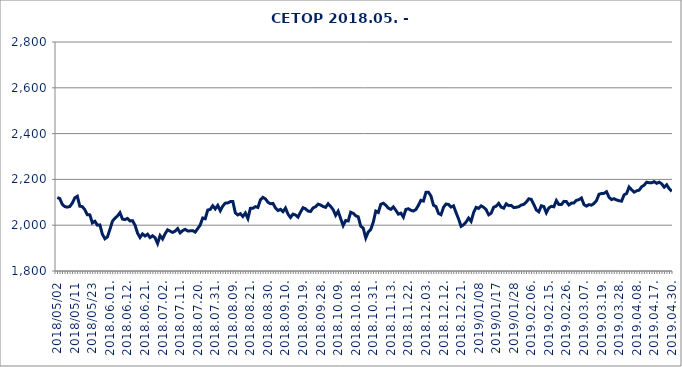
| Category | CETOP |
|---|---|
| 2018.05.02 | 2120.676 |
| 2018.05.03 | 2116.403 |
| 2018.05.04 | 2091.509 |
| 2018.05.07 | 2081.159 |
| 2018.05.08 | 2078.872 |
| 2018.05.09 | 2081.466 |
| 2018.05.10 | 2096.478 |
| 2018.05.11 | 2119.512 |
| 2018.05.14 | 2126.331 |
| 2018.05.15 | 2082.985 |
| 2018.05.16 | 2081.073 |
| 2018.05.17 | 2067.804 |
| 2018.05.18 | 2045.295 |
| 2018.05.22 | 2045.083 |
| 2018.05.23 | 2010.11 |
| 2018.05.24 | 2017.202 |
| 2018.05.25 | 2000.263 |
| 2018.05.28 | 2001.262 |
| 2018.05.29 | 1960.226 |
| 2018.05.30 | 1940.766 |
| 2018.05.31 | 1948.804 |
| 2018.06.01. | 1981.607 |
| 2018.06.04. | 2017.379 |
| 2018.06.05. | 2030.57 |
| 2018.06.06. | 2040.195 |
| 2018.06.07. | 2054.549 |
| 2018.06.08. | 2026.941 |
| 2018.06.11. | 2024.503 |
| 2018.06.12. | 2029.551 |
| 2018.06.13. | 2018.61 |
| 2018.06.14. | 2019.788 |
| 2018.06.15. | 2000.297 |
| 2018.06.18. | 1965.713 |
| 2018.06.19. | 1946.535 |
| 2018.06.20. | 1961.945 |
| 2018.06.21. | 1952.863 |
| 2018.06.22. | 1960.475 |
| 2018.06.25. | 1946.032 |
| 2018.06.26. | 1953.878 |
| 2018.06.27. | 1945.559 |
| 2018.06.28. | 1920.09 |
| 2018.06.29. | 1954.479 |
| 2018.07.02. | 1939.762 |
| 2018.07.03. | 1962.624 |
| 2018.07.04. | 1979.793 |
| 2018.07.05. | 1973.884 |
| 2018.07.06. | 1968.41 |
| 2018.07.09. | 1974.196 |
| 2018.07.10. | 1985.28 |
| 2018.07.11. | 1966.571 |
| 2018.07.12. | 1976.141 |
| 2018.07.13. | 1981.892 |
| 2018.07.16. | 1974.924 |
| 2018.07.17. | 1975.254 |
| 2018.07.18. | 1976.278 |
| 2018.07.19. | 1969.906 |
| 2018.07.20. | 1984.979 |
| 2018.07.23. | 2001.025 |
| 2018.07.24. | 2031.395 |
| 2018.07.25. | 2028.303 |
| 2018.07.26. | 2066.067 |
| 2018.07.27. | 2069.026 |
| 2018.07.30. | 2084.845 |
| 2018.07.31. | 2070.985 |
| 2018.08.01. | 2086.424 |
| 2018.08.02. | 2063.149 |
| 2018.08.03. | 2083.848 |
| 2018.08.06. | 2096.272 |
| 2018.08.07. | 2097.369 |
| 2018.08.08. | 2103.062 |
| 2018.08.09. | 2103.669 |
| 2018.08.10. | 2053.985 |
| 2018.08.13. | 2044.675 |
| 2018.08.14. | 2050.336 |
| 2018.08.15. | 2038.076 |
| 2018.08.16. | 2053.282 |
| 2018.08.17. | 2029.237 |
| 2018.08.21. | 2073.528 |
| 2018.08.22. | 2074.081 |
| 2018.08.23. | 2080.932 |
| 2018.08.24. | 2077.489 |
| 2018.08.27. | 2110.84 |
| 2018.08.28. | 2121.74 |
| 2018.08.29. | 2114.778 |
| 2018.08.30. | 2100.306 |
| 2018.08.31. | 2093.626 |
| 2018.09.03. | 2095.064 |
| 2018.09.04. | 2075.524 |
| 2018.09.05. | 2064.011 |
| 2018.09.06. | 2069.342 |
| 2018.09.07. | 2059.094 |
| 2018.09.10. | 2074.752 |
| 2018.09.11. | 2048.405 |
| 2018.09.12. | 2033.609 |
| 2018.09.13. | 2048.437 |
| 2018.09.14. | 2044.669 |
| 2018.09.17. | 2035.145 |
| 2018.09.18. | 2057.368 |
| 2018.09.19. | 2076.376 |
| 2018.09.20. | 2071.472 |
| 2018.09.21. | 2061.603 |
| 2018.09.24. | 2059.922 |
| 2018.09.25. | 2075.697 |
| 2018.09.26. | 2080.405 |
| 2018.09.27. | 2092.125 |
| 2018.09.28. | 2088.019 |
| 2018.10.01. | 2081.721 |
| 2018.10.02. | 2077.783 |
| 2018.10.03. | 2093.707 |
| 2018.10.04. | 2081.947 |
| 2018.10.05. | 2067.958 |
| 2018.10.08. | 2043.078 |
| 2018.10.09. | 2060.729 |
| 2018.10.10. | 2028.707 |
| 2018.10.11. | 1998.129 |
| 2018.10.12. | 2020.267 |
| 2018.10.15. | 2018.392 |
| 2018.10.16. | 2056.747 |
| 2018.10.17. | 2051.812 |
| 2018.10.18. | 2040.854 |
| 2018.10.19. | 2036.722 |
| 2018.10.24. | 1995.93 |
| 2018.10.25. | 1986.844 |
| 2018.10.26. | 1944.458 |
| 2018.10.29. | 1970.626 |
| 2018.10.30. | 1981.597 |
| 2018.10.31. | 2013.278 |
| 2018.11.05. | 2061.555 |
| 2018.11.06. | 2055.53 |
| 2018.11.07. | 2091.353 |
| 2018.11.08. | 2095.811 |
| 2018.11.09. | 2087.516 |
| 2018.11.12. | 2074.427 |
| 2018.11.13. | 2069.375 |
| 2018.11.14. | 2080.014 |
| 2018.11.15. | 2065.08 |
| 2018.11.16. | 2048.304 |
| 2018.11.19. | 2052.459 |
| 2018.11.20. | 2035.179 |
| 2018.11.21. | 2069.042 |
| 2018.11.22. | 2071.897 |
| 2018.11.23. | 2064.961 |
| 2018.11.26. | 2062.049 |
| 2018.11.27. | 2068.398 |
| 2018.11.28. | 2087.286 |
| 2018.11.29. | 2108.668 |
| 2018.11.30. | 2105.427 |
| 2018.12.03. | 2143.383 |
| 2018.12.04. | 2143.814 |
| 2018.12.05. | 2127.321 |
| 2018.12.06. | 2087.284 |
| 2018.12.07. | 2081.313 |
| 2018.12.10. | 2051.553 |
| 2018.12.11. | 2045.722 |
| 2018.12.12. | 2078.031 |
| 2018.12.13. | 2092.443 |
| 2018.12.14. | 2090.878 |
| 2018.12.17. | 2079.25 |
| 2018.12.18. | 2084.564 |
| 2018.12.19. | 2055.14 |
| 2018.12.20. | 2027.516 |
| 2018.12.21. | 1994.836 |
| 2018.12.27. | 2001.756 |
| 2018.12.28. | 2014.016 |
| 2019.01.02 | 2031.121 |
| 2019.01.03 | 2016.826 |
| 2019.01.04 | 2055.256 |
| 2019.01.07 | 2078.094 |
| 2019.01.08 | 2073.253 |
| 2019.01.09 | 2084.527 |
| 2019.01.10 | 2078.321 |
| 2019.01.11 | 2067.45 |
| 2019.01.14 | 2045.39 |
| 2019.01.15 | 2052.39 |
| 2019.01.16 | 2078.533 |
| 2019.01.17 | 2082.94 |
| 2019.01.18 | 2095.309 |
| 2019.01.21 | 2078.764 |
| 2019.01.22 | 2074.351 |
| 2019.01.23 | 2093.498 |
| 2019.01.24 | 2085.448 |
| 2019.01.25 | 2086.531 |
| 2019.01.28 | 2076.959 |
| 2019.01.29 | 2078.238 |
| 2019.01.30 | 2080.718 |
| 2019.01.31 | 2088.041 |
| 2019.02.01. | 2090.951 |
| 2019.02.04. | 2100.785 |
| 2019.02.05. | 2115.365 |
| 2019.02.06. | 2112.788 |
| 2019.02.07. | 2090.842 |
| 2019.02.08. | 2066.561 |
| 2019.02.11. | 2058.484 |
| 2019.02.12. | 2084.853 |
| 2019.02.13. | 2081.616 |
| 2019.02.14. | 2054.353 |
| 2019.02.15. | 2075.739 |
| 2019.02.18. | 2082.306 |
| 2019.02.19. | 2080.333 |
| 2019.02.20. | 2107.518 |
| 2019.02.21. | 2090.457 |
| 2019.02.22. | 2090.114 |
| 2019.02.25. | 2104.067 |
| 2019.02.26. | 2103.168 |
| 2019.02.27. | 2088.35 |
| 2019.02.28. | 2096.423 |
| 2019.03.01. | 2097.164 |
| 2019.03.04. | 2108.472 |
| 2019.03.05. | 2111.589 |
| 2019.03.06. | 2118.905 |
| 2019.03.07. | 2089.945 |
| 2019.03.08. | 2083.449 |
| 2019.03.11. | 2089.829 |
| 2019.03.12. | 2087.626 |
| 2019.03.13. | 2095.071 |
| 2019.03.14. | 2107.598 |
| 2019.03.18. | 2135.183 |
| 2019.03.19. | 2138.259 |
| 2019.03.20. | 2139.093 |
| 2019.03.21. | 2146.287 |
| 2019.03.22. | 2121.71 |
| 2019.03.25. | 2112.164 |
| 2019.03.26. | 2115.894 |
| 2019.03.27. | 2110.252 |
| 2019.03.28. | 2106.846 |
| 2019.03.29. | 2104.986 |
| 2019.04.01. | 2132.574 |
| 2019.04.02. | 2138.374 |
| 2019.04.03. | 2166.651 |
| 2019.04.04. | 2154.718 |
| 2019.04.05. | 2144.455 |
| 2019.04.08. | 2150.202 |
| 2019.04.09. | 2153.045 |
| 2019.04.10. | 2167.895 |
| 2019.04.11. | 2174.854 |
| 2019.04.12. | 2187.792 |
| 2019.04.15. | 2185.484 |
| 2019.04.16. | 2185.305 |
| 2019.04.17. | 2190.201 |
| 2019.04.18. | 2182.992 |
| 2019.04.23. | 2187.796 |
| 2019.04.24. | 2180.508 |
| 2019.04.25. | 2165.991 |
| 2019.04.26. | 2176.261 |
| 2019.04.29. | 2159.18 |
| 2019.04.30. | 2147.64 |